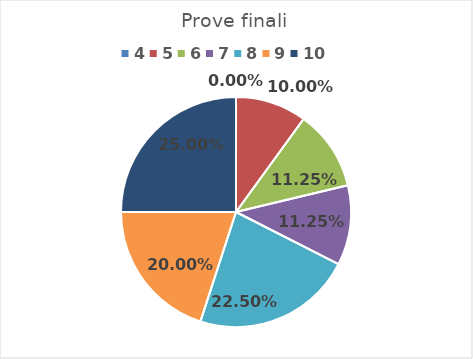
| Category | Series 0 |
|---|---|
| 4.0 | 0 |
| 5.0 | 0.1 |
| 6.0 | 0.112 |
| 7.0 | 0.112 |
| 8.0 | 0.225 |
| 9.0 | 0.2 |
| 10.0 | 0.25 |